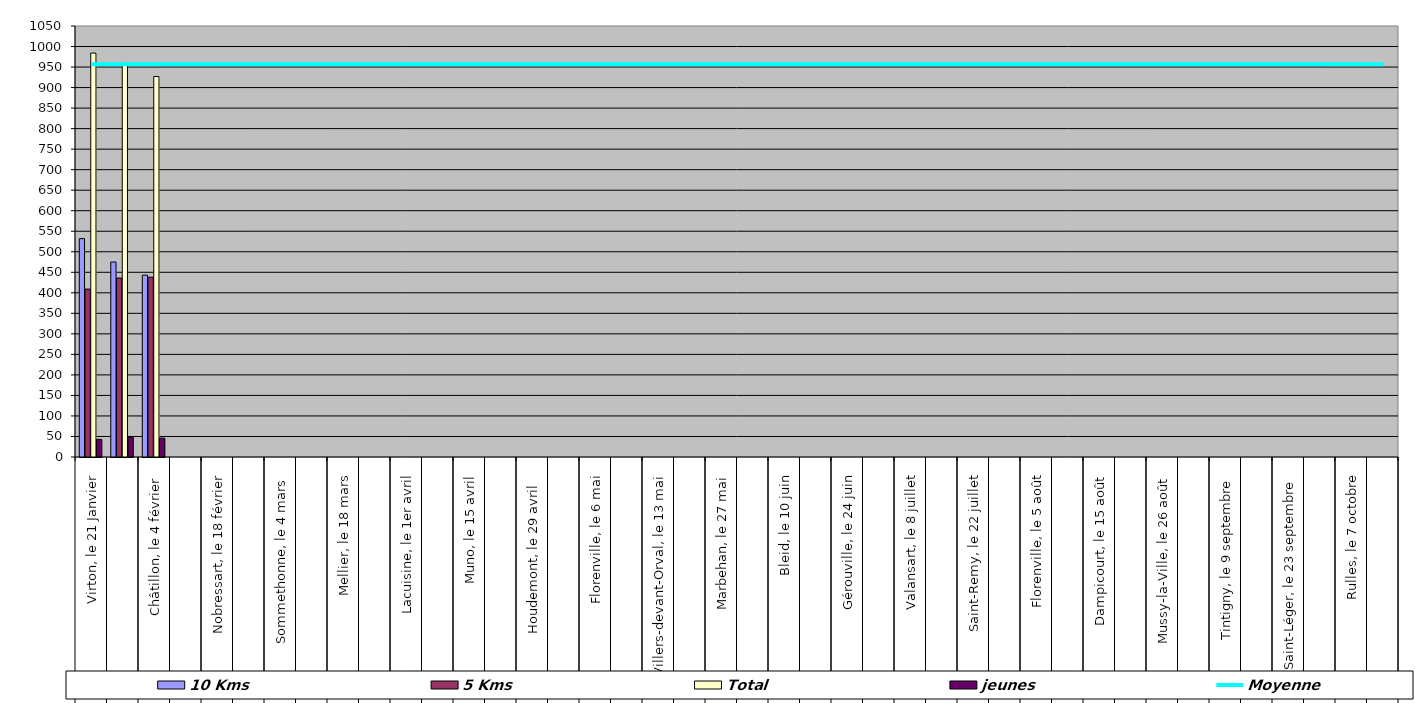
| Category | 10 Kms | 5 Kms | Total | jeunes |
|---|---|---|---|---|
| 0 | 532 | 409 | 984 | 43 |
| 1 | 475 | 436 | 959 | 48 |
| 2 | 443 | 438 | 927 | 46 |
| 3 | 0 | 0 | 0 | 0 |
| 4 | 0 | 0 | 0 | 0 |
| 5 | 0 | 0 | 0 | 0 |
| 6 | 0 | 0 | 0 | 0 |
| 7 | 0 | 0 | 0 | 0 |
| 8 | 0 | 0 | 0 | 0 |
| 9 | 0 | 0 | 0 | 0 |
| 10 | 0 | 0 | 0 | 0 |
| 11 | 0 | 0 | 0 | 0 |
| 12 | 0 | 0 | 0 | 0 |
| 13 | 0 | 0 | 0 | 0 |
| 14 | 0 | 0 | 0 | 0 |
| 15 | 0 | 0 | 0 | 0 |
| 16 | 0 | 0 | 0 | 0 |
| 17 | 0 | 0 | 0 | 0 |
| 18 | 0 | 0 | 0 | 0 |
| 19 | 0 | 0 | 0 | 0 |
| 20 | 0 | 0 | 0 | 0 |
| 21 | 0 | 0 | 0 | 0 |
| 22 | 0 | 0 | 0 | 0 |
| 23 | 0 | 0 | 0 | 0 |
| 24 | 0 | 0 | 0 | 0 |
| 25 | 0 | 0 | 0 | 0 |
| 26 | 0 | 0 | 0 | 0 |
| 27 | 0 | 0 | 0 | 0 |
| 28 | 0 | 0 | 0 | 0 |
| 29 | 0 | 0 | 0 | 0 |
| 30 | 0 | 0 | 0 | 0 |
| 31 | 0 | 0 | 0 | 0 |
| 32 | 0 | 0 | 0 | 0 |
| 33 | 0 | 0 | 0 | 0 |
| 34 | 0 | 0 | 0 | 0 |
| 35 | 0 | 0 | 0 | 0 |
| 36 | 0 | 0 | 0 | 0 |
| 37 | 0 | 0 | 0 | 0 |
| 38 | 0 | 0 | 0 | 0 |
| 39 | 0 | 0 | 0 | 0 |
| 40 | 0 | 0 | 0 | 0 |
| 41 | 0 | 0 | 0 | 0 |